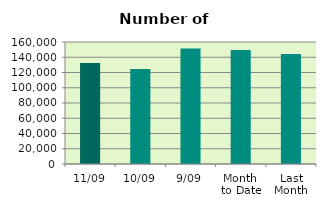
| Category | Series 0 |
|---|---|
| 11/09 | 132476 |
| 10/09 | 124614 |
| 9/09 | 151502 |
| Month 
to Date | 149520.667 |
| Last
Month | 144368.095 |